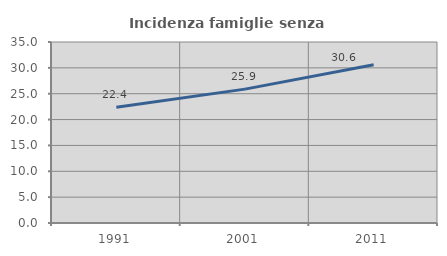
| Category | Incidenza famiglie senza nuclei |
|---|---|
| 1991.0 | 22.399 |
| 2001.0 | 25.885 |
| 2011.0 | 30.603 |